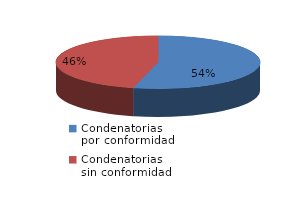
| Category | Series 0 |
|---|---|
| 0 | 7 |
| 1 | 6 |